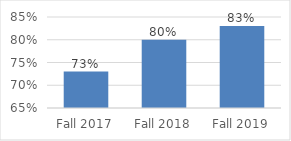
| Category | Series 0 |
|---|---|
| Fall 2017 | 0.73 |
| Fall 2018 | 0.8 |
| Fall 2019 | 0.83 |